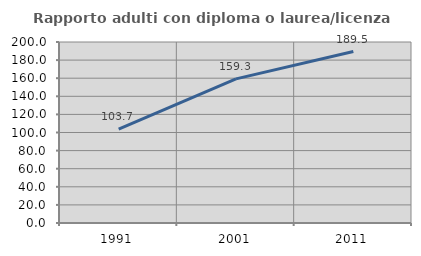
| Category | Rapporto adulti con diploma o laurea/licenza media  |
|---|---|
| 1991.0 | 103.714 |
| 2001.0 | 159.262 |
| 2011.0 | 189.498 |